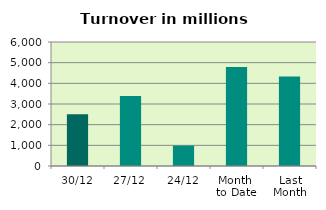
| Category | Series 0 |
|---|---|
| 30/12 | 2506.604 |
| 27/12 | 3383.323 |
| 24/12 | 988.202 |
| Month 
to Date | 4792.262 |
| Last
Month | 4332.538 |